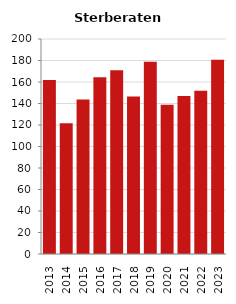
| Category | Sterberate der Bevölkerung ab 80 Jahre (auf Tsd.) |
|---|---|
| 2013.0 | 161.765 |
| 2014.0 | 121.528 |
| 2015.0 | 143.836 |
| 2016.0 | 164.474 |
| 2017.0 | 170.886 |
| 2018.0 | 146.417 |
| 2019.0 | 178.914 |
| 2020.0 | 138.801 |
| 2021.0 | 146.965 |
| 2022.0 | 151.899 |
| 2023.0 | 180.685 |